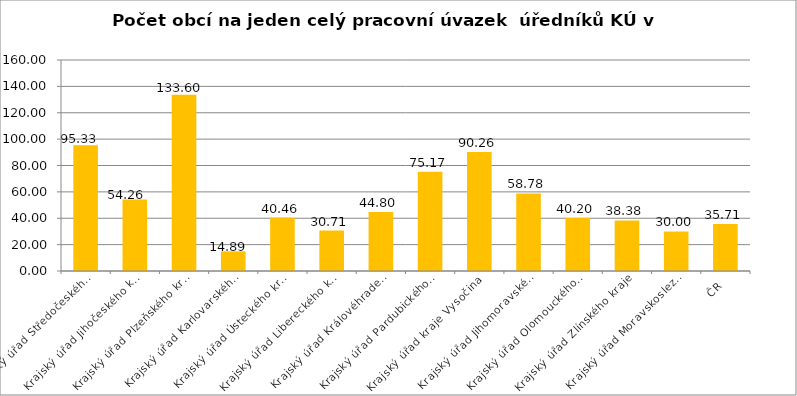
| Category | Počet obcí na jeden celý pracovní úvazek  úředníků KÚ |
|---|---|
| Krajský úřad Středočeského kraje | 95.33 |
| Krajský úřad Jihočeského kraje | 54.26 |
| Krajský úřad Plzeňského kraje | 133.6 |
| Krajský úřad Karlovarského kraje | 14.89 |
| Krajský úřad Ústeckého kraje | 40.46 |
| Krajský úřad Libereckého kraje | 30.71 |
| Krajský úřad Královéhradeckého kraje | 44.8 |
| Krajský úřad Pardubického kraje | 75.17 |
| Krajský úřad kraje Vysočina | 90.26 |
| Krajský úřad Jihomoravského kraje | 58.78 |
| Krajský úřad Olomouckého kraje | 40.2 |
| Krajský úřad Zlínského kraje | 38.38 |
| Krajský úřad Moravskoslezského kraje | 30 |
| ČR | 35.71 |